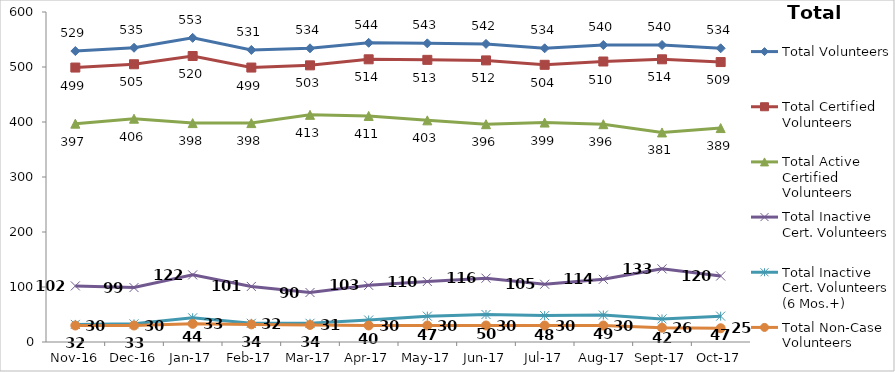
| Category | Total Volunteers | Total Certified Volunteers | Total Active Certified Volunteers | Total Inactive Cert. Volunteers | Total Inactive Cert. Volunteers (6 Mos.+) | Total Non-Case Volunteers |
|---|---|---|---|---|---|---|
| 2016-11-01 | 529 | 499 | 397 | 102 | 32 | 30 |
| 2016-12-01 | 535 | 505 | 406 | 99 | 33 | 30 |
| 2017-01-01 | 553 | 520 | 398 | 122 | 44 | 33 |
| 2017-02-01 | 531 | 499 | 398 | 101 | 34 | 32 |
| 2017-03-01 | 534 | 503 | 413 | 90 | 34 | 31 |
| 2017-04-01 | 544 | 514 | 411 | 103 | 40 | 30 |
| 2017-05-01 | 543 | 513 | 403 | 110 | 47 | 30 |
| 2017-06-01 | 542 | 512 | 396 | 116 | 50 | 30 |
| 2017-07-01 | 534 | 504 | 399 | 105 | 48 | 30 |
| 2017-08-01 | 540 | 510 | 396 | 114 | 49 | 30 |
| 2017-09-01 | 540 | 514 | 381 | 133 | 42 | 26 |
| 2017-10-01 | 534 | 509 | 389 | 120 | 47 | 25 |